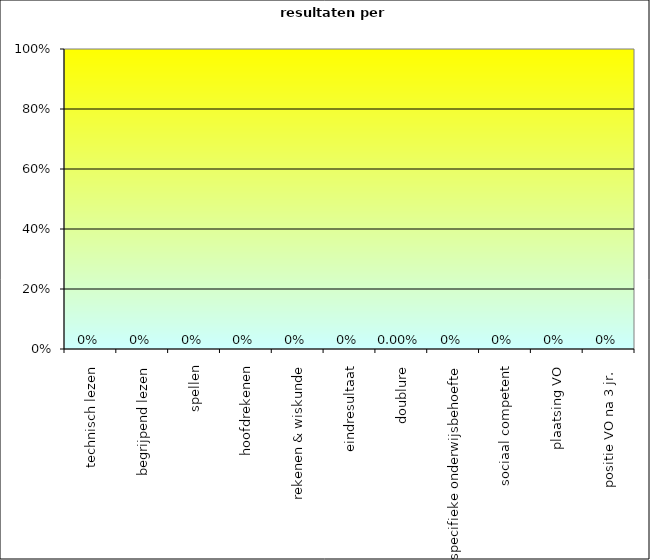
| Category | Series 0 |
|---|---|
| technisch lezen | 0 |
| begrijpend lezen | 0 |
| spellen | 0 |
| hoofdrekenen | 0 |
| rekenen & wiskunde | 0 |
| eindresultaat | 0 |
| doublure | 0 |
| specifieke onderwijsbehoefte | 0 |
| sociaal competent | 0 |
| plaatsing VO | 0 |
| positie VO na 3 jr.  | 0 |